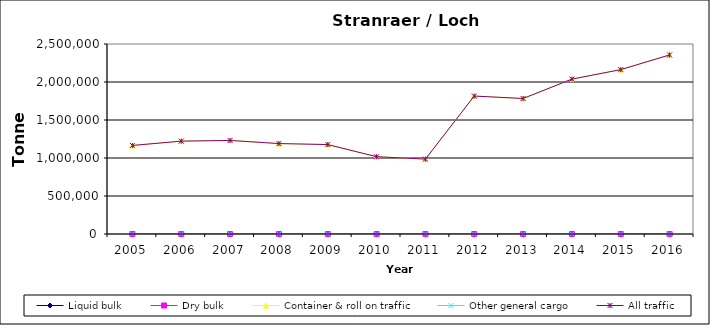
| Category | Liquid bulk | Dry bulk | Container & roll on traffic | Other general cargo | All traffic |
|---|---|---|---|---|---|
| 2005.0 | 0 | 0 | 1165000 | 0 | 1165000 |
| 2006.0 | 0 | 0 | 1222000 | 0 | 1222000 |
| 2007.0 | 0 | 0 | 1231000 | 0 | 1231000 |
| 2008.0 | 0 | 0 | 1190000 | 0 | 1190000 |
| 2009.0 | 0 | 0 | 1176987 | 0 | 1176987 |
| 2010.0 | 0 | 0 | 1017000 | 0 | 1017000 |
| 2011.0 | 0 | 0 | 986000 | 0 | 986000 |
| 2012.0 | 0 | 0 | 1815000 | 0 | 1815000 |
| 2013.0 | 0 | 0 | 1783000 | 0 | 1783000 |
| 2014.0 | 0 | 0 | 2038000 | 0 | 2038000 |
| 2015.0 | 0 | 0 | 2163000 | 0 | 2163000 |
| 2016.0 | 0 | 0 | 2356000 | 0 | 2356000 |